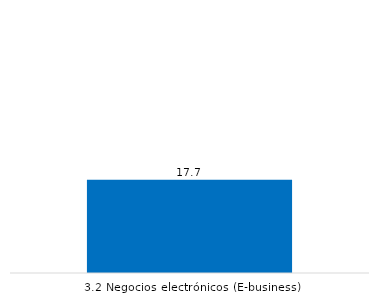
| Category | BOGOTÁ D.C. |
|---|---|
| 3.2 Negocios electrónicos (E-business) | 17.716 |